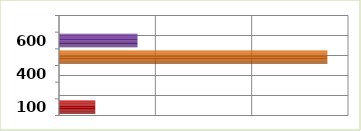
| Category | Series 0 |
|---|---|
| 100.0 | 3763234 |
| 200.0 | 0 |
| 400.0 | 0 |
| 500.0 | 27854305 |
| 600.0 | 8144760 |
| 700.0 | 0 |